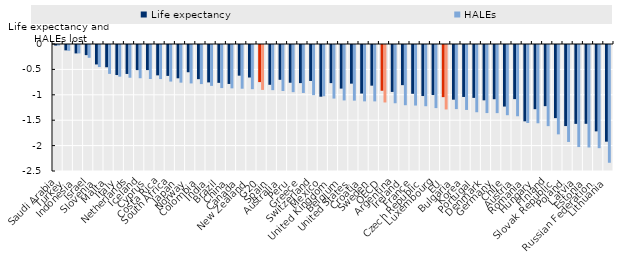
| Category | Life expectancy | HALEs |
|---|---|---|
| Saudi Arabia | -0.011 | -0.01 |
| Turkey | -0.106 | -0.114 |
| Indonesia | -0.166 | -0.166 |
| Israel | -0.199 | -0.252 |
| Slovenia | -0.383 | -0.434 |
| Malta | -0.438 | -0.569 |
| Italy | -0.591 | -0.623 |
| Netherlands | -0.57 | -0.644 |
| Iceland | -0.494 | -0.654 |
| Cyprus | -0.494 | -0.669 |
| Costa Rica | -0.598 | -0.671 |
| South Africa | -0.608 | -0.72 |
| Japan | -0.655 | -0.741 |
| Norway | -0.536 | -0.756 |
| Colombia | -0.673 | -0.769 |
| India | -0.736 | -0.805 |
| Brazil | -0.745 | -0.848 |
| China | -0.767 | -0.853 |
| Canada | -0.604 | -0.86 |
| New Zealand | -0.64 | -0.869 |
| G20 | -0.73 | -0.884 |
| Spain | -0.783 | -0.889 |
| Australia | -0.685 | -0.906 |
| Peru | -0.743 | -0.928 |
| Greece | -0.75 | -0.944 |
| Switzerland | -0.707 | -0.987 |
| Mexico | -1.018 | -1.009 |
| United Kingdom | -0.75 | -1.055 |
| Belgium | -0.858 | -1.091 |
| United States | -0.761 | -1.095 |
| Croatia | -0.956 | -1.109 |
| Sweden | -0.8 | -1.11 |
| OECD | -0.9 | -1.131 |
| Argentina | -0.924 | -1.147 |
| Ireland | -0.79 | -1.185 |
| France | -0.96 | -1.192 |
| Czech Republic | -1.005 | -1.205 |
| Luxembourg | -0.985 | -1.242 |
| EU | -1.027 | -1.269 |
| Bulgaria | -1.076 | -1.262 |
| Korea | -1.023 | -1.278 |
| Portugal | -1.041 | -1.323 |
| Denmark | -1.089 | -1.34 |
| Germany | -1.068 | -1.341 |
| Chile | -1.212 | -1.382 |
| Austria | -1.065 | -1.403 |
| Romania | -1.503 | -1.535 |
| Hungary | -1.264 | -1.541 |
| Finland | -1.204 | -1.597 |
| Slovak Republic | -1.439 | -1.759 |
| Poland | -1.596 | -1.908 |
| Latvia | -1.553 | -2.009 |
| Estonia | -1.551 | -2.017 |
| Russian Federation | -1.7 | -2.031 |
| Lithuania | -1.903 | -2.318 |